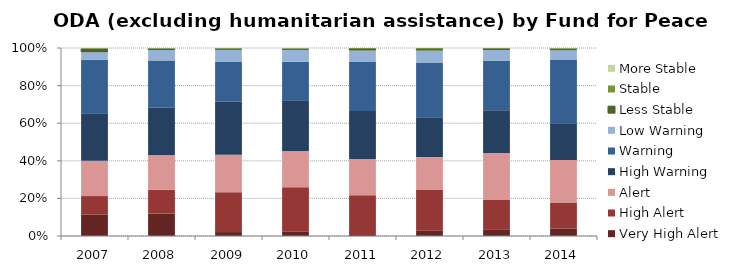
| Category | Very High Alert | High Alert | Alert | High Warning | Warning | Low Warning | Less Stable | Stable | More Stable |
|---|---|---|---|---|---|---|---|---|---|
| 2007.0 | 10954.118 | 9527.235 | 18163.628 | 24351.059 | 27369.811 | 4000.043 | 1651.216 | 326.851 | 134.66 |
| 2008.0 | 11722.16 | 12399.499 | 17930.546 | 24797.247 | 24717.486 | 5443.029 | 544.748 | 369.525 | 130.392 |
| 2009.0 | 2085.481 | 21068.738 | 19966.079 | 28092.086 | 21346.065 | 6348.894 | 289.125 | 405.765 | 106.135 |
| 2010.0 | 2351.505 | 24270.182 | 19748.251 | 27661.207 | 20907.706 | 6697.376 | 328.798 | 359.65 | 187.937 |
| 2011.0 | 559.882 | 21472.036 | 19616.851 | 26074.844 | 26787.446 | 6053.462 | 687.065 | 548.974 | 0 |
| 2012.0 | 2908.455 | 22039.597 | 17861.584 | 21525.898 | 29458.156 | 6858.118 | 635.425 | 636.126 | 0 |
| 2013.0 | 3877.444 | 16848.797 | 26962.51 | 24584.129 | 28378.214 | 6329.405 | 639.182 | 426.685 | 46.018 |
| 2014.0 | 4080.831 | 13923.503 | 22828.825 | 19794.531 | 34134.217 | 5068.218 | 529.912 | 543.238 | 96.702 |